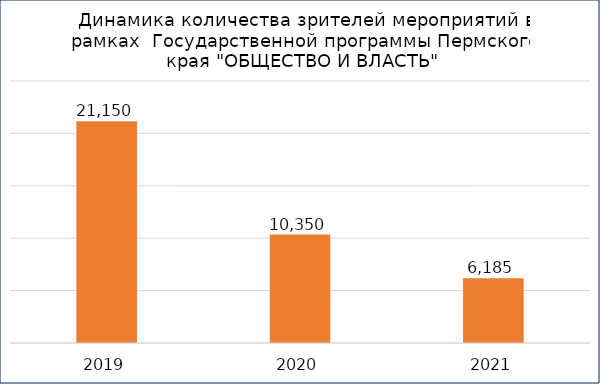
| Category | Количество зрителей |
|---|---|
| 2019.0 | 21150 |
| 2020.0 | 10350 |
| 2021.0 | 6185 |